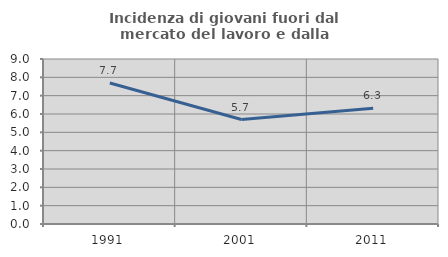
| Category | Incidenza di giovani fuori dal mercato del lavoro e dalla formazione  |
|---|---|
| 1991.0 | 7.692 |
| 2001.0 | 5.696 |
| 2011.0 | 6.32 |